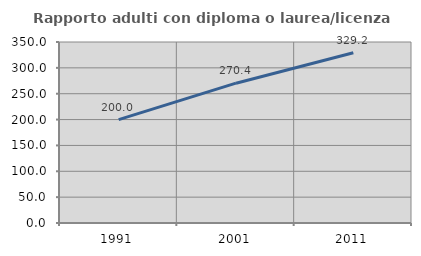
| Category | Rapporto adulti con diploma o laurea/licenza media  |
|---|---|
| 1991.0 | 200 |
| 2001.0 | 270.37 |
| 2011.0 | 329.167 |